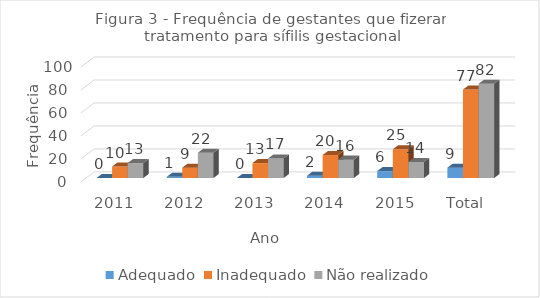
| Category | Adequado | Inadequado | Não realizado |
|---|---|---|---|
| 2011 | 0 | 10 | 13 |
| 2012 | 1 | 9 | 22 |
| 2013 | 0 | 13 | 17 |
| 2014 | 2 | 20 | 16 |
| 2015 | 6 | 25 | 14 |
| Total | 9 | 77 | 82 |